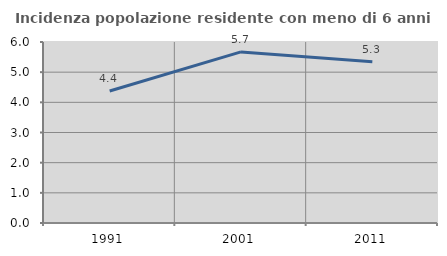
| Category | Incidenza popolazione residente con meno di 6 anni |
|---|---|
| 1991.0 | 4.376 |
| 2001.0 | 5.672 |
| 2011.0 | 5.344 |